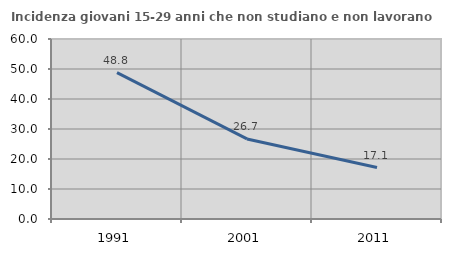
| Category | Incidenza giovani 15-29 anni che non studiano e non lavorano  |
|---|---|
| 1991.0 | 48.816 |
| 2001.0 | 26.696 |
| 2011.0 | 17.14 |